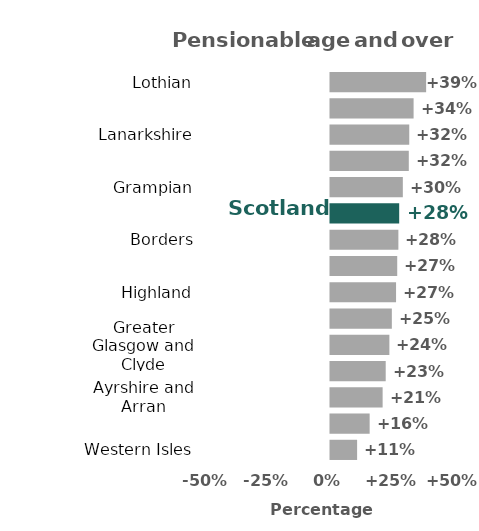
| Category | Series 0 |
|---|---|
| Western Isles | 10.957 |
| Dumfries and Galloway | 16.113 |
| Ayrshire and Arran | 21.452 |
| Tayside | 22.717 |
| Greater Glasgow and Clyde | 24.226 |
| Orkney | 25.243 |
| Highland | 26.98 |
| Fife | 27.457 |
| Borders | 27.93 |
| Scotland | 28.271 |
| Grampian | 29.764 |
| Shetland | 32.222 |
| Lanarkshire | 32.408 |
| Forth Valley | 34.192 |
| Lothian | 39.353 |